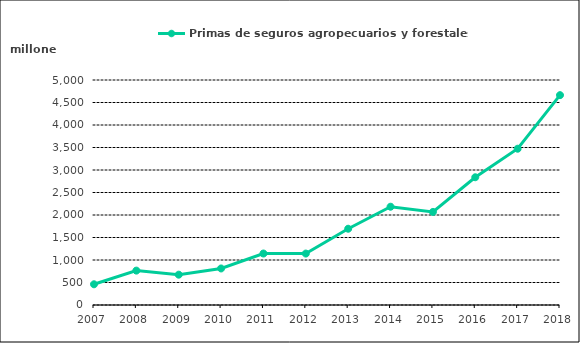
| Category | Primas de seguros agropecuarios y forestales |
|---|---|
| 2007.0 | 460009.843 |
| 2008.0 | 764079.836 |
| 2009.0 | 673899.503 |
| 2010.0 | 811673.685 |
| 2011.0 | 1143849.628 |
| 2012.0 | 1143141.579 |
| 2013.0 | 1694779.855 |
| 2014.0 | 2183675.329 |
| 2015.0 | 2067951.895 |
| 2016.0 | 2838682.808 |
| 2017.0 | 3472699.647 |
| 2018.0 | 4663280.45 |